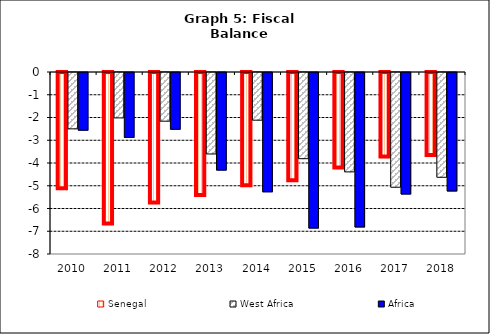
| Category | Senegal | West Africa | Africa |
|---|---|---|---|
| 2010.0 | -5.151 | -2.477 | -2.535 |
| 2011.0 | -6.707 | -1.995 | -2.853 |
| 2012.0 | -5.784 | -2.14 | -2.495 |
| 2013.0 | -5.449 | -3.581 | -4.291 |
| 2014.0 | -5.019 | -2.096 | -5.245 |
| 2015.0 | -4.803 | -3.788 | -6.84 |
| 2016.0 | -4.24 | -4.368 | -6.79 |
| 2017.0 | -3.755 | -5.043 | -5.342 |
| 2018.0 | -3.691 | -4.606 | -5.208 |